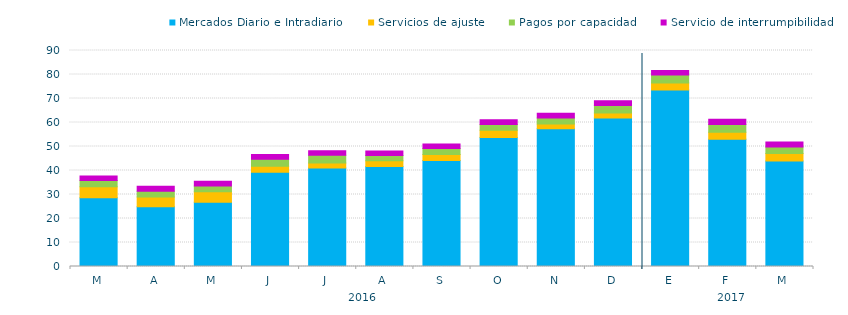
| Category | Mercados Diario e Intradiario  | Servicios de ajuste | Pagos por capacidad | Servicio de interrumpibilidad |
|---|---|---|---|---|
| M | 28.65 | 4.54 | 2.63 | 1.87 |
| A | 24.85 | 4.07 | 2.48 | 2.02 |
| M | 26.74 | 4.37 | 2.43 | 2.03 |
| J | 39.3 | 2.51 | 2.89 | 2 |
| J | 41.06 | 2.03 | 3.27 | 1.82 |
| A | 41.62 | 2.41 | 2.2 | 1.89 |
| S | 44.17 | 2.46 | 2.52 | 1.94 |
| O | 53.78 | 3 | 2.37 | 2.04 |
| N | 57.41 | 1.93 | 2.55 | 1.95 |
| D | 61.87 | 2.04 | 3.22 | 1.93 |
| E | 73.59 | 2.9 | 3.31 | 1.9 |
| F | 53.05 | 2.84 | 3.26 | 2.19 |
| M | 43.94 | 3.19 | 2.63 | 2.07 |